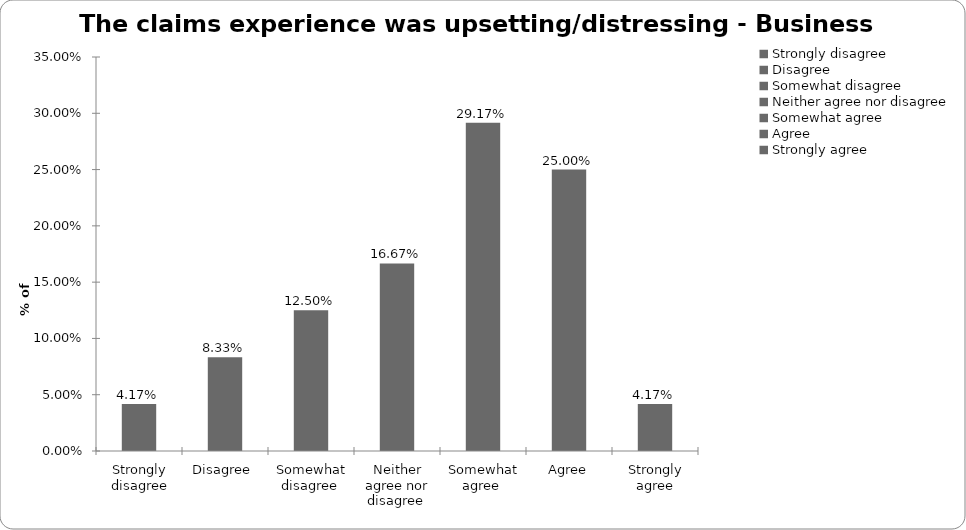
| Category | Series 0 |
|---|---|
| Strongly disagree | 0.042 |
| Disagree  | 0.083 |
| Somewhat disagree  | 0.125 |
| Neither agree nor disagree  | 0.167 |
| Somewhat agree  | 0.292 |
| Agree | 0.25 |
| Strongly agree | 0.042 |